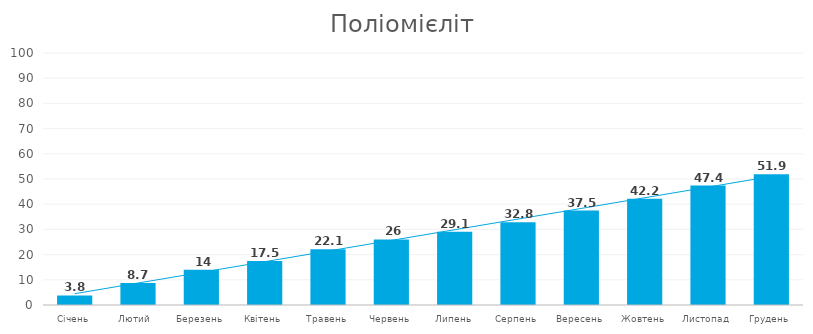
| Category | Поліомієліт |
|---|---|
| Січень | 3.8 |
| Лютий  | 8.7 |
| Березень | 14 |
| Квітень | 17.5 |
| Травень | 22.1 |
| Червень | 26 |
| Липень | 29.1 |
| Серпень | 32.8 |
| Вересень | 37.5 |
| Жовтень | 42.2 |
| Листопад | 47.4 |
| Грудень | 51.9 |